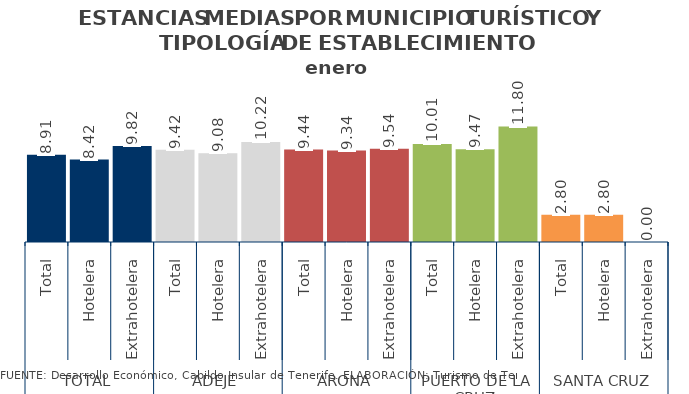
| Category | Series 2 |
|---|---|
| 0 | 8.91 |
| 1 | 8.42 |
| 2 | 9.82 |
| 3 | 9.42 |
| 4 | 9.08 |
| 5 | 10.22 |
| 6 | 9.443 |
| 7 | 9.339 |
| 8 | 9.54 |
| 9 | 10.01 |
| 10 | 9.47 |
| 11 | 11.8 |
| 12 | 2.797 |
| 13 | 2.797 |
| 14 | 0 |